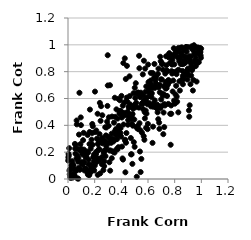
| Category | Series 0 |
|---|---|
| 0.8048160379679911 | 0.797 |
| 0.6412530690746505 | 0.562 |
| 0.036848699491668656 | 0.107 |
| 0.8508803725687043 | 0.921 |
| 0.6913978955041147 | 0.911 |
| 0.3902861109157759 | 0.489 |
| 0.5729293044220957 | 0.292 |
| 0.8110375856228726 | 0.695 |
| 0.24806886873163023 | 0.543 |
| 0.5027506385205199 | 0.555 |
| 0.44573678088368307 | 0.501 |
| 0.3434325248215889 | 0.202 |
| 0.561053336274124 | 0.78 |
| 0.24146370101987005 | 0.042 |
| 0.7851093031259042 | 0.652 |
| 0.20997103220456537 | 0.186 |
| 0.4303696479341876 | 0.05 |
| 0.10259249432398762 | 0.125 |
| 0.7798508613737885 | 0.852 |
| 0.24624403608130385 | 0.272 |
| 0.1730998822928173 | 0.081 |
| 0.8730987772841702 | 0.916 |
| 0.4771677226068377 | 0.184 |
| 0.19122029559249532 | 0.07 |
| 0.6785153978333146 | 0.823 |
| 0.03936746894879441 | 0.038 |
| 0.3206762801182168 | 0.272 |
| 0.38258311964538483 | 0.329 |
| 0.3844784113742594 | 0.507 |
| 0.3681660735472492 | 0.345 |
| 0.9689709140385898 | 0.866 |
| 0.6462743098852863 | 0.551 |
| 0.3099631757098164 | 0.213 |
| 0.8287489505397968 | 0.977 |
| 0.6857148374560557 | 0.374 |
| 0.4087598701721895 | 0.153 |
| 0.8693786946081973 | 0.96 |
| 0.8402111569531753 | 0.911 |
| 0.19983808856500268 | 0.163 |
| 0.806252504612378 | 0.63 |
| 0.29783745806520745 | 0.923 |
| 0.5157899796305667 | 0.017 |
| 0.8810528820988379 | 0.873 |
| 0.1490733598868999 | 0.033 |
| 0.4493409079521291 | 0.405 |
| 0.3490803277755809 | 0.196 |
| 0.8484357229467564 | 0.939 |
| 0.5293458375933919 | 0.631 |
| 0.4749559854918523 | 0.448 |
| 0.9367280181722548 | 0.659 |
| 0.6038354053874117 | 0.722 |
| 0.21098582234768798 | 0.202 |
| 0.12069687325942724 | 0.127 |
| 0.23005677510613035 | 0.144 |
| 0.020099144285102177 | 0.008 |
| 0.053496653326204194 | 0.227 |
| 0.14721049749832843 | 0.328 |
| 0.6044248210849298 | 0.681 |
| 0.9335570871204969 | 0.966 |
| 0.3604468680700396 | 0.331 |
| 0.643231094605576 | 0.685 |
| 0.9166533555953422 | 0.881 |
| 0.18891535484765548 | 0.161 |
| 0.37750553958991206 | 0.597 |
| 0.06481725295512407 | 0.436 |
| 0.49156706209330986 | 0.639 |
| 0.7650278276645177 | 0.865 |
| 0.7452519194500642 | 0.803 |
| 0.7916464292578508 | 0.923 |
| 0.4068009759231473 | 0.472 |
| 0.710834982930877 | 0.637 |
| 0.3133821718840352 | 0.303 |
| 0.7490497289972962 | 0.703 |
| 0.7035959168923077 | 0.741 |
| 0.3720860219728402 | 0.45 |
| 0.32833079129278914 | 0.155 |
| 0.6681677695936914 | 0.555 |
| 0.8272894318442069 | 0.497 |
| 0.04891064579619808 | 0.026 |
| 0.16629359704728555 | 0.046 |
| 0.023419354639812224 | 0.074 |
| 0.7985722187898523 | 0.918 |
| 0.16991982198271896 | 0.103 |
| 0.15444429967702467 | 0.145 |
| 0.18132061599412014 | 0.343 |
| 0.1702111666286856 | 0.226 |
| 0.9632057759010246 | 0.869 |
| 0.19315112764321993 | 0.129 |
| 0.31952743968310005 | 0.212 |
| 0.5693081703095949 | 0.882 |
| 0.004251761930587647 | 0.188 |
| 0.7430421501633343 | 0.619 |
| 0.697427239802067 | 0.743 |
| 0.9724679511926295 | 0.98 |
| 0.2173645918353844 | 0.3 |
| 0.9247368946319299 | 0.839 |
| 0.3632946576171775 | 0.519 |
| 0.5954264067940941 | 0.557 |
| 0.46419356395634676 | 0.455 |
| 0.6228622303132113 | 0.541 |
| 0.057300796040171006 | 0.255 |
| 0.4566102081277897 | 0.532 |
| 0.10893398358415206 | 0.183 |
| 0.6988001847450622 | 0.593 |
| 0.5646004305925687 | 0.622 |
| 0.33209803322518666 | 0.3 |
| 0.8081089625540443 | 0.953 |
| 0.596931256951981 | 0.371 |
| 0.3476574740772269 | 0.291 |
| 0.1397871017129596 | 0.07 |
| 0.45891351403084435 | 0.485 |
| 0.7169305897725119 | 0.495 |
| 0.9788435390067388 | 0.934 |
| 0.5787156323363809 | 0.823 |
| 0.7810713402161075 | 0.786 |
| 0.18611837737125309 | 0.393 |
| 0.05574871979741117 | 0.189 |
| 0.6547178969240556 | 0.735 |
| 0.17496583944255623 | 0.061 |
| 0.058492048325131656 | 0.059 |
| 0.2678159602451641 | 0.208 |
| 0.9384272792149398 | 0.964 |
| 0.1375155422211428 | 0.164 |
| 0.5160043820291768 | 0.381 |
| 0.695459926332687 | 0.878 |
| 0.8390021300136582 | 0.659 |
| 0.5818468911274911 | 0.651 |
| 0.9431416118818199 | 0.977 |
| 0.3654362141563176 | 0.223 |
| 0.35707544375562 | 0.335 |
| 0.7148270507419545 | 0.334 |
| 0.626209773768254 | 0.611 |
| 0.13431791821315836 | 0.175 |
| 0.9470443444692167 | 0.936 |
| 0.5500117425196831 | 0.15 |
| 0.9153122706672439 | 0.87 |
| 0.3588409693787901 | 0.371 |
| 0.5316174513720017 | 0.532 |
| 0.6642284447830702 | 0.529 |
| 0.7004161813679188 | 0.543 |
| 0.6769812162106348 | 0.446 |
| 0.3511859927170877 | 0.606 |
| 0.5750788586440214 | 0.499 |
| 0.8186558311569169 | 0.576 |
| 0.5678505033831696 | 0.319 |
| 0.2934922295686538 | 0.427 |
| 0.6314525070198469 | 0.677 |
| 0.28744572002241525 | 0.244 |
| 0.07585643305672715 | 0.129 |
| 0.32721904516621003 | 0.338 |
| 0.2792917243822691 | 0.386 |
| 0.1784138644780996 | 0.254 |
| 0.03143687584005224 | 0.133 |
| 0.576562385706362 | 0.452 |
| 0.37175541279924923 | 0.221 |
| 0.46128121574113173 | 0.765 |
| 0.8016925349532842 | 0.561 |
| 0.0025459312360142203 | 0.161 |
| 0.7255467778042767 | 0.625 |
| 0.8432535680032459 | 0.905 |
| 0.011003315112321476 | 0.062 |
| 0.7592884501775933 | 0.937 |
| 0.5193021105814963 | 0.383 |
| 0.7622489972222245 | 0.725 |
| 0.20782627532021755 | 0.165 |
| 0.07356854222332326 | 0.225 |
| 0.4187776700320601 | 0.492 |
| 0.9803273252812976 | 0.87 |
| 0.12572369945368816 | 0.079 |
| 0.9962262809924376 | 0.903 |
| 0.955091528708835 | 0.876 |
| 0.6069447748188267 | 0.673 |
| 0.5394631853148955 | 0.205 |
| 0.22332432873438213 | 0.031 |
| 0.8957698591122799 | 0.741 |
| 0.7891461199333766 | 0.734 |
| 0.0996434141433899 | 0.224 |
| 0.41515034023000635 | 0.864 |
| 0.5905139478385715 | 0.573 |
| 0.41675038389553093 | 0.406 |
| 0.773657236450272 | 0.548 |
| 0.44212130910114417 | 0.843 |
| 0.02567283399442044 | 0.099 |
| 0.7357055891118258 | 0.915 |
| 0.712584043953238 | 0.814 |
| 0.3528253194551974 | 0.358 |
| 0.12858840296570873 | 0.206 |
| 0.3243486007848635 | 0.27 |
| 0.7292748688178311 | 0.785 |
| 0.6128191903510176 | 0.636 |
| 0.2652916094593917 | 0.066 |
| 0.17699813911388584 | 0.294 |
| 0.18206875130349506 | 0.41 |
| 0.03367878854220705 | 0.01 |
| 0.20457784158936188 | 0.35 |
| 0.35437475748089486 | 0.463 |
| 0.30188381878609855 | 0.267 |
| 0.7832535737038714 | 0.888 |
| 0.8378237581727616 | 0.895 |
| 0.8878453451417957 | 0.982 |
| 0.7227709617211416 | 0.558 |
| 0.27119482135427997 | 0.096 |
| 0.6741525502740761 | 0.783 |
| 0.2846269977825291 | 0.325 |
| 0.04248283480025894 | 0.017 |
| 0.10569333759641586 | 0.108 |
| 0.3149154482639664 | 0.699 |
| 0.10613027869866468 | 0.198 |
| 0.6008738392626107 | 0.853 |
| 0.5583455519500062 | 0.567 |
| 0.019526181794592687 | 0.074 |
| 0.7319281915286389 | 0.723 |
| 0.3863287146455442 | 0.49 |
| 0.2502086209785679 | 0.297 |
| 0.5118125078379672 | 0.568 |
| 0.9359485178314961 | 0.827 |
| 0.02626952171052562 | 0.104 |
| 0.6189620236211834 | 0.734 |
| 0.32380969739468063 | 0.282 |
| 0.23548311139305195 | 0.138 |
| 0.08802271889430067 | 0.068 |
| 0.3303849235876428 | 0.466 |
| 0.5362201288249856 | 0.416 |
| 0.39445658199639444 | 0.378 |
| 0.8211185322290097 | 0.809 |
| 0.884926725820854 | 0.984 |
| 0.554770012315542 | 0.345 |
| 0.5047507612138872 | 0.604 |
| 0.8138530986290082 | 0.781 |
| 0.4936511180437289 | 0.275 |
| 0.5257141636804944 | 0.645 |
| 0.07729899798224192 | 0.002 |
| 0.22195285289826638 | 0.486 |
| 0.6611505145517063 | 0.766 |
| 0.48879040461983303 | 0.524 |
| 0.2574499699053005 | 0.475 |
| 0.15372361772268164 | 0.11 |
| 0.12216927066635556 | 0.064 |
| 0.9569947193062386 | 0.905 |
| 0.80283383021104 | 0.932 |
| 0.2272596090131578 | 0.213 |
| 0.7329941121807774 | 0.674 |
| 0.05169937658675466 | 0.262 |
| 0.2389293736291419 | 0.567 |
| 0.19409776975635853 | 0.181 |
| 0.1114741315942896 | 0.112 |
| 0.09720404005544354 | 0.401 |
| 0.40507617500263177 | 0.241 |
| 0.012877030387724989 | 0.034 |
| 0.006186548690355044 | 0.176 |
| 0.6480284451013497 | 0.858 |
| 0.49990928045378746 | 0.24 |
| 0.08582776277927397 | 0.643 |
| 0.3066266022679924 | 0.46 |
| 0.9495267015247435 | 0.88 |
| 0.6338795058866682 | 0.269 |
| 0.09564642717308515 | 0.459 |
| 0.845718230965016 | 0.857 |
| 0.8798297608187026 | 0.773 |
| 0.6104640549995154 | 0.565 |
| 0.9773982121956997 | 0.869 |
| 0.9023455612930342 | 0.983 |
| 0.2024244632717279 | 0.651 |
| 0.33630020221003804 | 0.296 |
| 0.09334830717075344 | 0.26 |
| 0.436367324262943 | 0.58 |
| 0.4037290532755966 | 0.458 |
| 0.5858075881716347 | 0.381 |
| 0.5639277297016065 | 0.52 |
| 0.7377081769587723 | 0.848 |
| 0.5701948762098781 | 0.588 |
| 0.2982828558493133 | 0.697 |
| 0.06602702955017496 | 0.407 |
| 0.7767001165413997 | 0.804 |
| 0.8540516027454408 | 0.981 |
| 0.2885757618384845 | 0.384 |
| 0.5536851859976736 | 0.561 |
| 0.8714939164513476 | 0.884 |
| 0.8169132408031525 | 0.945 |
| 0.9604627735899908 | 0.864 |
| 0.13353072803829116 | 0.076 |
| 0.16116040444494234 | 0.26 |
| 0.645677240170929 | 0.754 |
| 0.8923328184327886 | 0.809 |
| 0.2445044592955393 | 0.433 |
| 0.49742016741247386 | 0.443 |
| 0.5212950531172788 | 0.395 |
| 0.46291493973622916 | 0.618 |
| 0.22435324083276867 | 0.26 |
| 0.11328195037163839 | 0.29 |
| 0.04542772198222292 | 0.073 |
| 0.14172102281630997 | 0.058 |
| 0.8233251014317677 | 0.907 |
| 0.38136331223588515 | 0.396 |
| 0.5447603854827491 | 0.052 |
| 0.44630200163421735 | 0.576 |
| 0.6152622673486504 | 0.618 |
| 0.06954432759656205 | 0.005 |
| 0.9538337138075925 | 0.983 |
| 0.07823886163864259 | 0.157 |
| 0.29567267988940527 | 0.545 |
| 0.6209758316676542 | 0.79 |
| 0.4711321878775796 | 0.305 |
| 0.46733872729850434 | 0.555 |
| 0.04623738387279152 | 0.027 |
| 0.9185754063880479 | 0.707 |
| 0.9111752724431398 | 0.915 |
| 0.9930836196339418 | 0.946 |
| 0.90451054648089 | 0.901 |
| 0.8899003543592757 | 0.907 |
| 0.693345514646579 | 0.529 |
| 0.5431662295309747 | 0.363 |
| 0.3896380970998756 | 0.587 |
| 0.30515867955544 | 0.397 |
| 0.029177174765890736 | 0.015 |
| 0.03473832320113161 | 0.03 |
| 0.5886629924351962 | 0.487 |
| 0.835591764989214 | 0.728 |
| 0.9950032082174447 | 0.92 |
| 0.2588373860797932 | 0.306 |
| 0.060135003793550426 | 0.067 |
| 0.7463788877903434 | 0.726 |
| 0.592633580028227 | 0.608 |
| 0.3162496985230245 | 0.062 |
| 0.20126166044251567 | 0.101 |
| 0.6241956494478965 | 0.705 |
| 0.08679455388774969 | 0.077 |
| 0.9274336521782525 | 0.859 |
| 0.7091191694231516 | 0.625 |
| 0.6804002939747648 | 0.682 |
| 0.5352446029543049 | 0.826 |
| 0.982633620595707 | 0.963 |
| 0.0014173401793039727 | 0.137 |
| 0.41253459651920354 | 0.145 |
| 0.42771417932345396 | 0.286 |
| 0.3024526287686202 | 0.313 |
| 0.5869260479446795 | 0.69 |
| 0.9847453372522129 | 0.954 |
| 0.9502558711059987 | 0.93 |
| 0.48625964030769175 | 0.397 |
| 0.40118843626863987 | 0.619 |
| 0.26075685522955766 | 0.265 |
| 0.19626981598331356 | 0.063 |
| 0.8961353264265077 | 0.796 |
| 0.008951014118490511 | 0.23 |
| 0.8670603424126889 | 0.743 |
| 0.9716295100431026 | 0.876 |
| 0.4686047192664362 | 0.462 |
| 0.7047381538014715 | 0.856 |
| 0.12635470994151074 | 0.19 |
| 0.31008074148234 | 0.125 |
| 0.374935448754331 | 0.36 |
| 0.3447304075864913 | 0.421 |
| 0.27539367529782316 | 0.275 |
| 0.9126504838109599 | 0.549 |
| 0.7666258164017056 | 0.486 |
| 0.28295579248363056 | 0.216 |
| 0.508342251192858 | 0.714 |
| 0.39321054214407003 | 0.343 |
| 0.26812384855005045 | 0.194 |
| 0.48136507836854203 | 0.455 |
| 0.8472000293063932 | 0.978 |
| 0.6095097475139214 | 0.646 |
| 0.1566214265517475 | 0.032 |
| 0.7397729982779764 | 0.678 |
| 0.8538222985448833 | 0.857 |
| 0.28131536653435685 | 0.17 |
| 0.5410113143359803 | 0.61 |
| 0.16263601469403038 | 0.35 |
| 0.6719616360124111 | 0.497 |
| 0.5008025319284766 | 0.68 |
| 0.9450038752325354 | 0.997 |
| 0.7218275351179362 | 0.387 |
| 0.36753989602754356 | 0.297 |
| 0.9644264661205062 | 0.726 |
| 0.24244693615111684 | 0.15 |
| 0.4552812150957252 | 0.538 |
| 0.7934859104057508 | 0.975 |
| 0.861456895910077 | 0.769 |
| 0.23647019126137492 | 0.335 |
| 0.7708872536418231 | 0.917 |
| 0.4523679563511088 | 0.468 |
| 0.435180899166777 | 0.27 |
| 0.8562217136463667 | 0.742 |
| 0.1841013702159052 | 0.255 |
| 0.4219888138147045 | 0.57 |
| 0.9236828227154171 | 0.771 |
| 0.11961414322667153 | 0.219 |
| 0.7569432886640876 | 0.906 |
| 0.9912602430137946 | 0.977 |
| 0.8759689700202944 | 0.774 |
| 0.23329685106903708 | 0.224 |
| 0.3784666447933918 | 0.238 |
| 0.76153144905519 | 0.935 |
| 0.6887186105020155 | 0.646 |
| 0.7956687180878755 | 0.584 |
| 0.719378736267653 | 0.692 |
| 0.041499562839395265 | 0.101 |
| 0.09057465893928303 | 0.213 |
| 0.7746516469322732 | 0.486 |
| 0.7553424669311714 | 0.719 |
| 0.9665617627023164 | 0.942 |
| 0.3987209460061791 | 0.316 |
| 0.9742837852943418 | 0.978 |
| 0.4844253448565549 | 0.484 |
| 0.7269521220533531 | 0.548 |
| 0.9069609003898131 | 0.512 |
| 0.6872224141608977 | 0.702 |
| 0.5829618563947645 | 0.51 |
| 0.4335052004827897 | 0.745 |
| 0.13169487578507857 | 0.162 |
| 0.6566089395323323 | 0.75 |
| 0.2639255128353661 | 0.283 |
| 0.2765287404126788 | 0.285 |
| 0.6390117044772514 | 0.539 |
| 0.9301674912684056 | 0.811 |
| 0.5992929948883348 | 0.411 |
| 0.8153905685128157 | 0.614 |
| 0.9205150469132967 | 0.912 |
| 0.4259065800518511 | 0.899 |
| 0.8583198121879995 | 0.806 |
| 0.016319693774990665 | 0.016 |
| 0.513187397122194 | 0.639 |
| 0.6663663677588026 | 0.527 |
| 0.11756236196857932 | 0.344 |
| 0.4729816625497727 | 0.184 |
| 0.06354872401932923 | 0.153 |
| 0.7516971592958311 | 0.56 |
| 0.7074827867167729 | 0.861 |
| 0.8300571113545581 | 0.814 |
| 0.4414608648082849 | 0.607 |
| 0.3342864665711034 | 0.206 |
| 0.9583146697958732 | 0.841 |
| 0.3386570557855668 | 0.29 |
| 0.9411610354700035 | 0.738 |
| 0.5262022897289605 | 0.371 |
| 0.7867224411858997 | 0.797 |
| 0.4288211925171365 | 0.292 |
| 0.4382168163578531 | 0.343 |
| 0.5229539007081078 | 0.39 |
| 0.833956175453485 | 0.878 |
| 0.6356167118776629 | 0.79 |
| 0.9019803704293399 | 0.772 |
| 0.49475358526100255 | 0.543 |
| 0.14583691243497582 | 0.046 |
| 0.8620066643203624 | 0.706 |
| 0.7974026840709623 | 0.854 |
| 0.7699843633873352 | 0.255 |
| 0.3411244877127755 | 0.28 |
| 0.08046556629204787 | 0.083 |
| 0.15036181048545097 | 0.196 |
| 0.5062537922012279 | 0.535 |
| 0.014703220502637145 | 0.072 |
| 0.6725819227668881 | 0.547 |
| 0.989411404189051 | 0.941 |
| 0.21224475868005416 | 0.361 |
| 0.8993334392982846 | 0.822 |
| 0.39648743595194247 | 0.507 |
| 0.4236894743046 | 0.474 |
| 0.7534884722674006 | 0.738 |
| 0.533160720813824 | 0.918 |
| 0.1011751668344194 | 0.122 |
| 0.27282527164016507 | 0.133 |
| 0.2900080108782295 | 0.268 |
| 0.48282163197100664 | 0.113 |
| 0.08239851724877918 | 0.331 |
| 0.9985994271823669 | 0.971 |
| 0.629030960506534 | 0.639 |
| 0.6521424917634908 | 0.679 |
| 0.2543821224929723 | 0.163 |
| 0.2184824302737793 | 0.154 |
| 0.9094795172371621 | 0.464 |
| 0.41083057306726245 | 0.546 |
| 0.9284357248829761 | 0.989 |
| 0.6626427791664942 | 0.692 |
| 0.6581896940297888 | 0.714 |
| 0.25399014575965473 | 0.11 |
| 0.5490534452314146 | 0.632 |
| 0.47865498994771744 | 0.41 |
| 0.7411382445262601 | 0.809 |
| 0.0705422653985541 | 0.175 |
| 0.14342377212769908 | 0.203 |
| 0.1644417291298606 | 0.517 |
| 0.11558285317234294 | 0.119 |
| 0.6179660438168715 | 0.696 |
| 0.5466750071893155 | 0.643 |
| 0.8832712474533523 | 0.783 |
| 0.6503352628211341 | 0.586 |
| 0.6378421120396448 | 0.39 |
| 0.556653714259773 | 0.556 |
| 0.864092065002325 | 0.857 |
| 0.4513612883704159 | 0.439 |
| 0.8765018873034283 | 0.863 |
| 0.21545099588051694 | 0.127 |
| 0.22934550306465137 | 0.271 |
| 0.9868953963175638 | 0.955 |
| 0.6834623554245248 | 0.421 |
| 0.8904267720241162 | 0.949 |
| 0.8255797019972418 | 0.961 |
| 0.1595955461793569 | 0.029 |